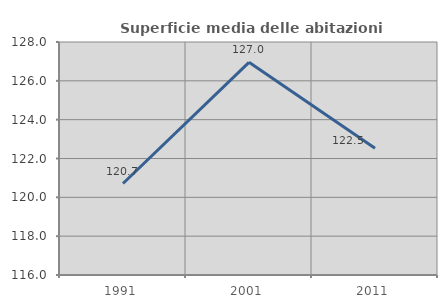
| Category | Superficie media delle abitazioni occupate |
|---|---|
| 1991.0 | 120.712 |
| 2001.0 | 126.954 |
| 2011.0 | 122.525 |